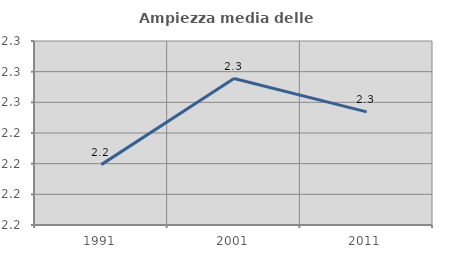
| Category | Ampiezza media delle famiglie |
|---|---|
| 1991.0 | 2.219 |
| 2001.0 | 2.276 |
| 2011.0 | 2.254 |